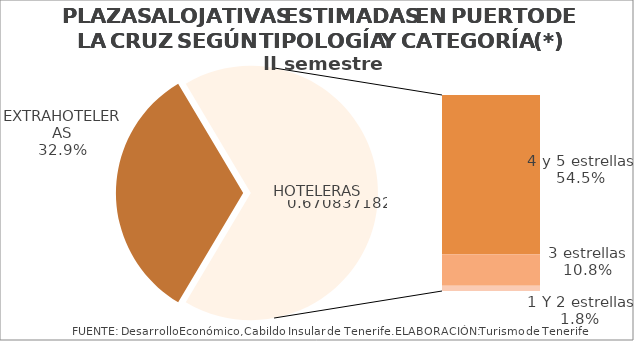
| Category | II semestre 2014 |
|---|---|
| EXTRAHOTELERAS | 0.329 |
| 4 y 5 estrellas | 0.545 |
| 3 estrellas | 0.108 |
| 1 Y 2 estrellas | 0.018 |